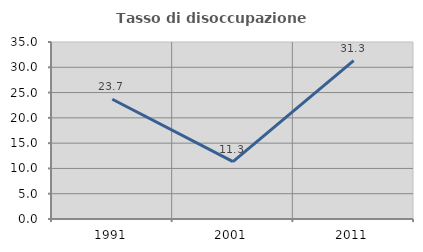
| Category | Tasso di disoccupazione giovanile  |
|---|---|
| 1991.0 | 23.678 |
| 2001.0 | 11.336 |
| 2011.0 | 31.333 |